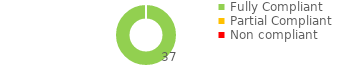
| Category | Series 0 |
|---|---|
| Fully Compliant | 37 |
| Partial Compliant | 0 |
| Non compliant | 0 |